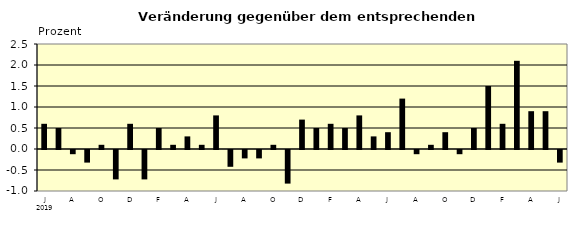
| Category | Series 0 |
|---|---|
| 0 | 0.6 |
| 1 | 0.5 |
| 2 | -0.1 |
| 3 | -0.3 |
| 4 | 0.1 |
| 5 | -0.7 |
| 6 | 0.6 |
| 7 | -0.7 |
| 8 | 0.5 |
| 9 | 0.1 |
| 10 | 0.3 |
| 11 | 0.1 |
| 12 | 0.8 |
| 13 | -0.4 |
| 14 | -0.2 |
| 15 | -0.2 |
| 16 | 0.1 |
| 17 | -0.8 |
| 18 | 0.7 |
| 19 | 0.5 |
| 20 | 0.6 |
| 21 | 0.5 |
| 22 | 0.8 |
| 23 | 0.3 |
| 24 | 0.4 |
| 25 | 1.2 |
| 26 | -0.1 |
| 27 | 0.1 |
| 28 | 0.4 |
| 29 | -0.1 |
| 30 | 0.5 |
| 31 | 1.5 |
| 32 | 0.6 |
| 33 | 2.1 |
| 34 | 0.9 |
| 35 | 0.9 |
| 36 | -0.3 |